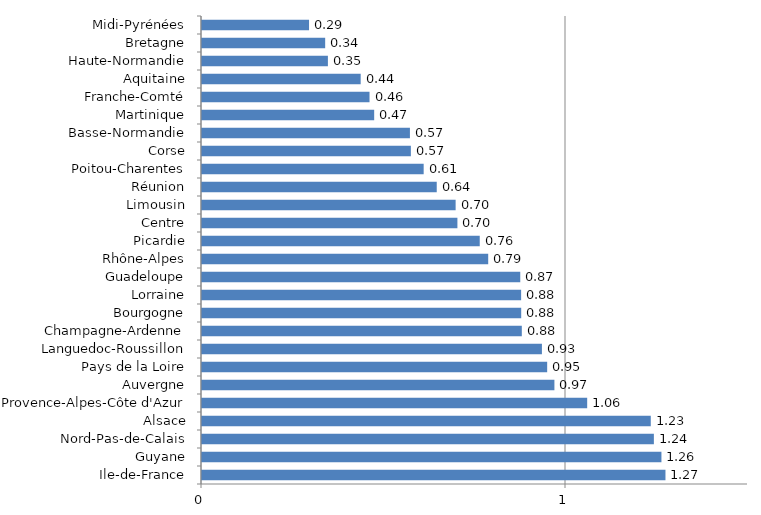
| Category | Series 0 |
|---|---|
| Ile-de-France | 1.273 |
| Guyane | 1.262 |
| Nord-Pas-de-Calais | 1.241 |
| Alsace | 1.233 |
| Provence-Alpes-Côte d'Azur | 1.058 |
| Auvergne | 0.968 |
| Pays de la Loire | 0.948 |
| Languedoc-Roussillon | 0.934 |
| Champagne-Ardenne | 0.879 |
| Bourgogne | 0.877 |
| Lorraine | 0.877 |
| Guadeloupe | 0.874 |
| Rhône-Alpes | 0.786 |
| Picardie | 0.763 |
| Centre | 0.702 |
| Limousin | 0.697 |
| Réunion | 0.645 |
| Poitou-Charentes | 0.609 |
| Corse | 0.574 |
| Basse-Normandie | 0.571 |
| Martinique | 0.473 |
| Franche-Comté | 0.46 |
| Aquitaine | 0.436 |
| Haute-Normandie | 0.346 |
| Bretagne | 0.338 |
| Midi-Pyrénées | 0.294 |